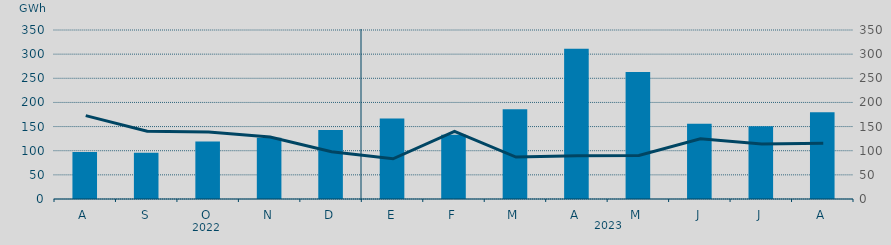
| Category | Energía a subir |
|---|---|
| A | 97.587 |
| S | 95.748 |
| O | 118.914 |
| N | 126.653 |
| D | 143.004 |
| E | 166.862 |
| F | 132.923 |
| M | 185.844 |
| A | 310.964 |
| M | 263.086 |
| J | 155.797 |
| J | 150.424 |
| A | 179.728 |